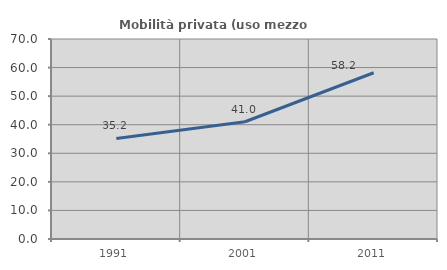
| Category | Mobilità privata (uso mezzo privato) |
|---|---|
| 1991.0 | 35.18 |
| 2001.0 | 41.042 |
| 2011.0 | 58.182 |